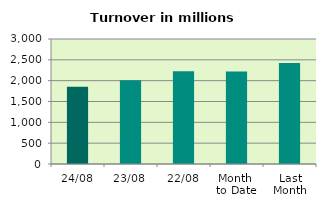
| Category | Series 0 |
|---|---|
| 24/08 | 1851.281 |
| 23/08 | 2008.319 |
| 22/08 | 2228.614 |
| Month 
to Date | 2220.65 |
| Last
Month | 2421.628 |